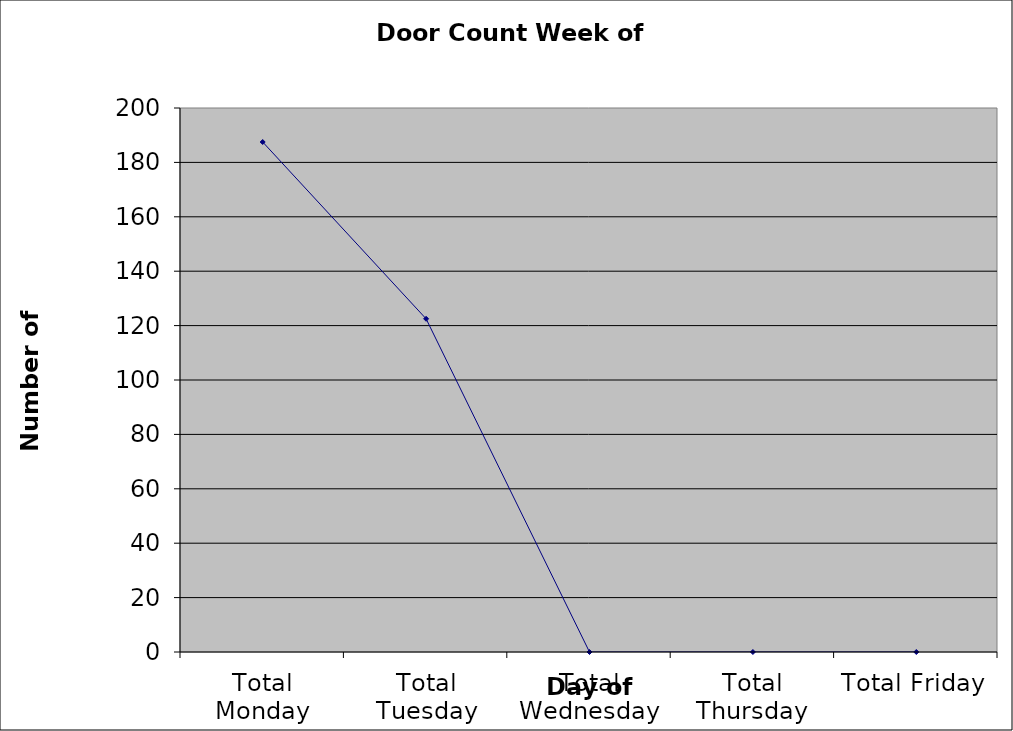
| Category | Series 0 |
|---|---|
| Total Monday | 187.5 |
| Total Tuesday | 122.5 |
| Total Wednesday | 0 |
| Total Thursday | 0 |
| Total Friday | 0 |